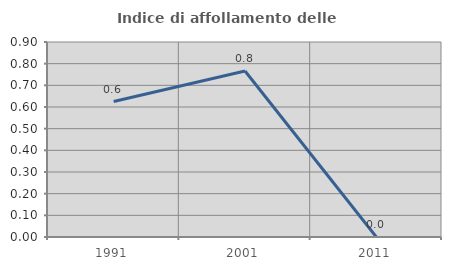
| Category | Indice di affollamento delle abitazioni  |
|---|---|
| 1991.0 | 0.625 |
| 2001.0 | 0.766 |
| 2011.0 | 0 |